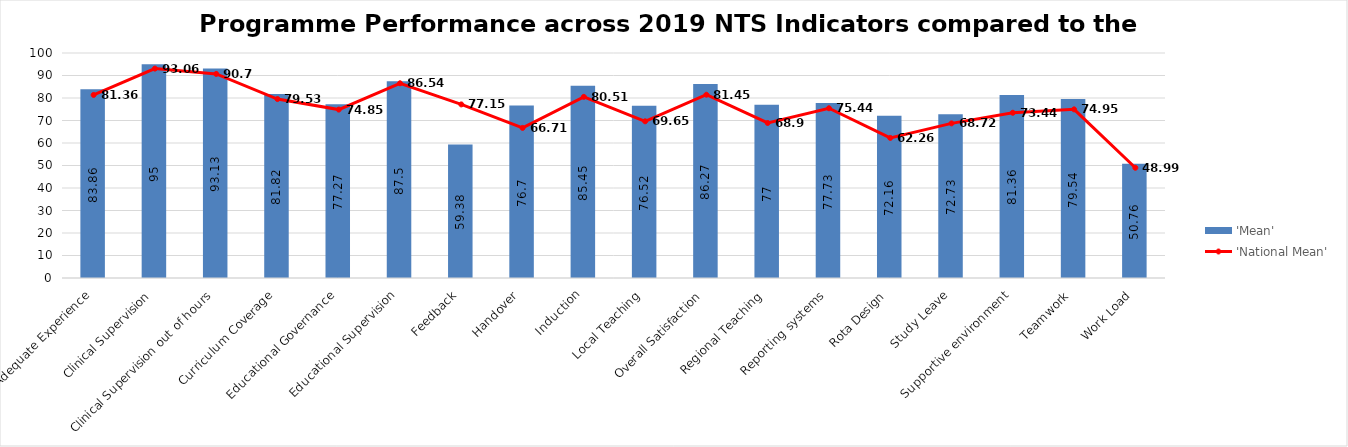
| Category | 'Mean' |
|---|---|
| Adequate Experience | 83.86 |
| Clinical Supervision | 95 |
| Clinical Supervision out of hours | 93.13 |
| Curriculum Coverage | 81.82 |
| Educational Governance | 77.27 |
| Educational Supervision | 87.5 |
| Feedback | 59.38 |
| Handover | 76.7 |
| Induction | 85.45 |
| Local Teaching | 76.52 |
| Overall Satisfaction | 86.27 |
| Regional Teaching | 77 |
| Reporting systems | 77.73 |
| Rota Design | 72.16 |
| Study Leave | 72.73 |
| Supportive environment | 81.36 |
| Teamwork | 79.54 |
| Work Load | 50.76 |